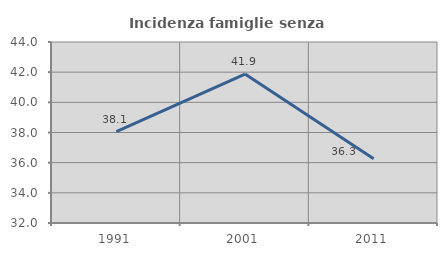
| Category | Incidenza famiglie senza nuclei |
|---|---|
| 1991.0 | 38.06 |
| 2001.0 | 41.875 |
| 2011.0 | 36.264 |